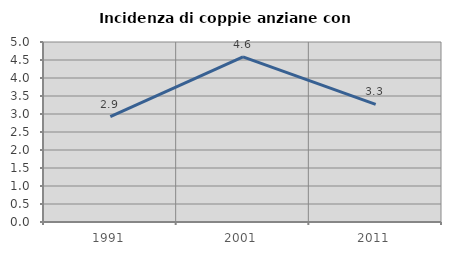
| Category | Incidenza di coppie anziane con figli |
|---|---|
| 1991.0 | 2.926 |
| 2001.0 | 4.587 |
| 2011.0 | 3.268 |